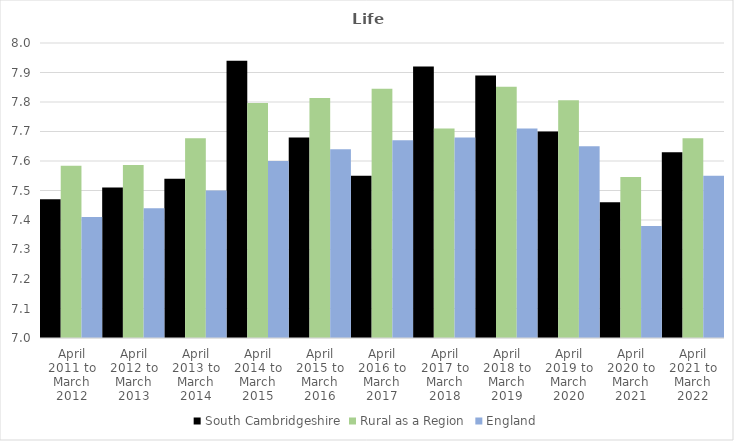
| Category | South Cambridgeshire | Rural as a Region | England |
|---|---|---|---|
| April 2011 to March 2012 | 7.47 | 7.584 | 7.41 |
| April 2012 to March 2013 | 7.51 | 7.586 | 7.44 |
| April 2013 to March 2014 | 7.54 | 7.677 | 7.5 |
| April 2014 to March 2015 | 7.94 | 7.797 | 7.6 |
| April 2015 to March 2016 | 7.68 | 7.813 | 7.64 |
| April 2016 to March 2017 | 7.55 | 7.845 | 7.67 |
| April 2017 to March 2018 | 7.92 | 7.71 | 7.68 |
| April 2018 to March 2019 | 7.89 | 7.852 | 7.71 |
| April 2019 to March 2020 | 7.7 | 7.806 | 7.65 |
| April 2020 to March 2021 | 7.46 | 7.546 | 7.38 |
| April 2021 to March 2022 | 7.63 | 7.677 | 7.55 |